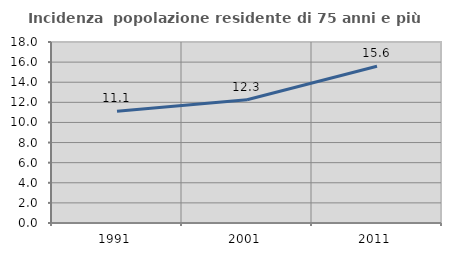
| Category | Incidenza  popolazione residente di 75 anni e più |
|---|---|
| 1991.0 | 11.118 |
| 2001.0 | 12.253 |
| 2011.0 | 15.585 |